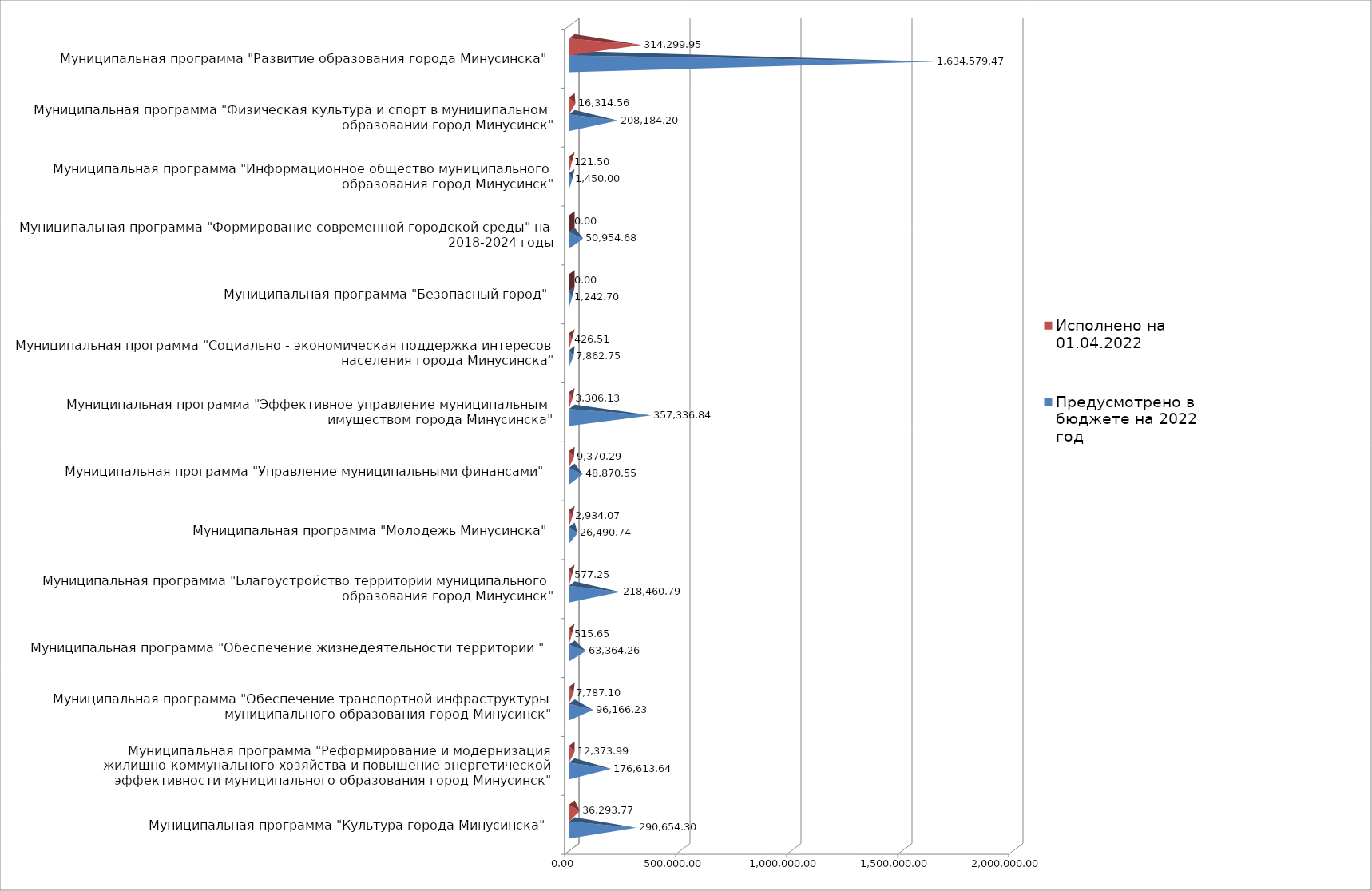
| Category | Предусмотрено в бюджете на 2022 год | Исполнено на 01.04.2022 |
|---|---|---|
| Муниципальная программа "Культура города Минусинска" | 290654.3 | 36293.77 |
| Муниципальная программа "Реформирование и модернизация жилищно-коммунального хозяйства и повышение энергетической эффективности муниципального образования город Минусинск" | 176613.64 | 12373.99 |
| Муниципальная программа "Обеспечение транспортной инфраструктуры муниципального образования город Минусинск" | 96166.23 | 7787.1 |
| Муниципальная программа "Обеспечение жизнедеятельности территории " | 63364.26 | 515.65 |
| Муниципальная программа "Благоустройство территории муниципального образования город Минусинск" | 218460.79 | 577.25 |
| Муниципальная программа "Молодежь Минусинска" | 26490.74 | 2934.07 |
| Муниципальная программа "Управление муниципальными финансами" | 48870.55 | 9370.29 |
| Муниципальная программа "Эффективное управление муниципальным имуществом города Минусинска" | 357336.84 | 3306.13 |
| Муниципальная программа "Социально - экономическая поддержка интересов населения города Минусинска" | 7862.75 | 426.51 |
| Муниципальная программа "Безопасный город" | 1242.7 | 0 |
| Муниципальная программа "Формирование современной городской среды" на 2018-2024 годы | 50954.68 | 0 |
| Муниципальная программа "Информационное общество муниципального образования город Минусинск" | 1450 | 121.5 |
| Муниципальная программа "Физическая культура и спорт в муниципальном образовании город Минусинск" | 208184.2 | 16314.56 |
| Муниципальная программа "Развитие образования города Минусинска" | 1634579.47 | 314299.95 |